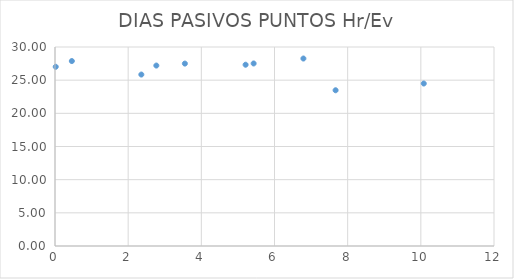
| Category | Series 0 |
|---|---|
| 0.01999999999999602 | 27.017 |
| 0.46000000000000085 | 27.881 |
| 7.669999999999995 | 23.477 |
| 2.769999999999996 | 27.202 |
| 5.210000000000001 | 27.328 |
| 3.5500000000000007 | 27.499 |
| 6.789999999999999 | 28.262 |
| 5.43 | 27.517 |
| 2.3599999999999994 | 25.846 |
| 10.079999999999998 | 24.495 |